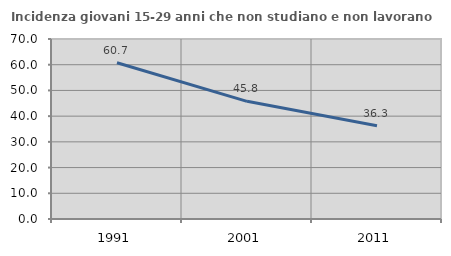
| Category | Incidenza giovani 15-29 anni che non studiano e non lavorano  |
|---|---|
| 1991.0 | 60.741 |
| 2001.0 | 45.756 |
| 2011.0 | 36.275 |